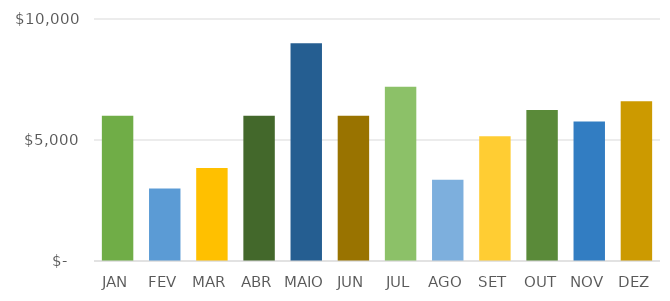
| Category | Series 0 |
|---|---|
| JAN | 6000 |
| FEV | 3000 |
| MAR | 3840 |
| ABR | 6000 |
| MAIO | 9000 |
| JUN | 6000 |
| JUL | 7200 |
| AGO | 3360 |
| SET | 5160 |
| OUT | 6240 |
| NOV | 5760 |
| DEZ | 6600 |